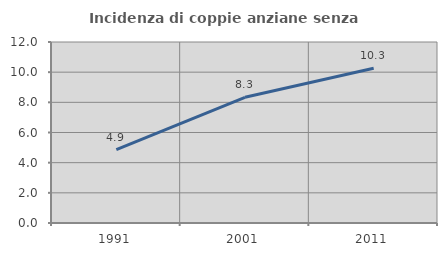
| Category | Incidenza di coppie anziane senza figli  |
|---|---|
| 1991.0 | 4.866 |
| 2001.0 | 8.333 |
| 2011.0 | 10.261 |